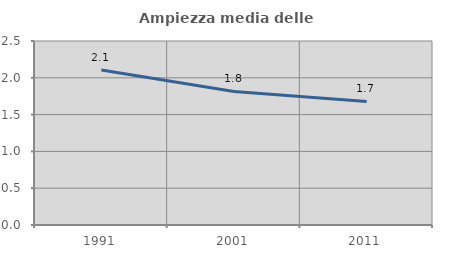
| Category | Ampiezza media delle famiglie |
|---|---|
| 1991.0 | 2.105 |
| 2001.0 | 1.815 |
| 2011.0 | 1.678 |